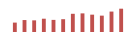
| Category | Importações (2) |
|---|---|
| 0 | 62681.056 |
| 1 | 79621.593 |
| 2 | 77709.867 |
| 3 | 88593.929 |
| 4 | 80744.22 |
| 5 | 85348.563 |
| 6 | 121368.935 |
| 7 | 124143.971 |
| 8 | 115571.707 |
| 9 | 109068.986 |
| 10 | 136178.726 |
| 11 | 155395.87 |